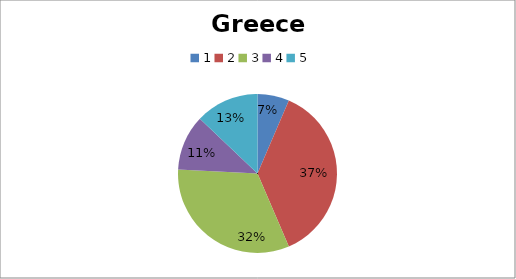
| Category | Greece |
|---|---|
| 0 | 4 |
| 1 | 23 |
| 2 | 20 |
| 3 | 7 |
| 4 | 8 |